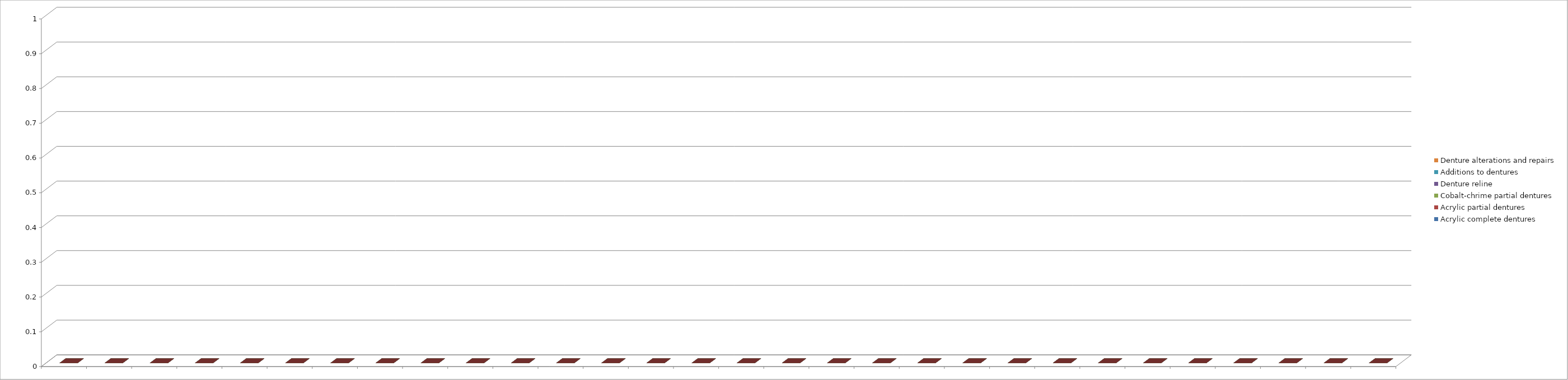
| Category | Acrylic complete dentures | Acrylic partial dentures | Cobalt-chrime partial dentures | Denture reline | Additions to dentures | Denture alterations and repairs |
|---|---|---|---|---|---|---|
| 0 | 0 | 0 | 0 | 0 | 0 | 0 |
| 1 | 0 | 0 | 0 | 0 | 0 | 0 |
| 2 | 0 | 0 | 0 | 0 | 0 | 0 |
| 3 | 0 | 0 | 0 | 0 | 0 | 0 |
| 4 | 0 | 0 | 0 | 0 | 0 | 0 |
| 5 | 0 | 0 | 0 | 0 | 0 | 0 |
| 6 | 0 | 0 | 0 | 0 | 0 | 0 |
| 7 | 0 | 0 | 0 | 0 | 0 | 0 |
| 8 | 0 | 0 | 0 | 0 | 0 | 0 |
| 9 | 0 | 0 | 0 | 0 | 0 | 0 |
| 10 | 0 | 0 | 0 | 0 | 0 | 0 |
| 11 | 0 | 0 | 0 | 0 | 0 | 0 |
| 12 | 0 | 0 | 0 | 0 | 0 | 0 |
| 13 | 0 | 0 | 0 | 0 | 0 | 0 |
| 14 | 0 | 0 | 0 | 0 | 0 | 0 |
| 15 | 0 | 0 | 0 | 0 | 0 | 0 |
| 16 | 0 | 0 | 0 | 0 | 0 | 0 |
| 17 | 0 | 0 | 0 | 0 | 0 | 0 |
| 18 | 0 | 0 | 0 | 0 | 0 | 0 |
| 19 | 0 | 0 | 0 | 0 | 0 | 0 |
| 20 | 0 | 0 | 0 | 0 | 0 | 0 |
| 21 | 0 | 0 | 0 | 0 | 0 | 0 |
| 22 | 0 | 0 | 0 | 0 | 0 | 0 |
| 23 | 0 | 0 | 0 | 0 | 0 | 0 |
| 24 | 0 | 0 | 0 | 0 | 0 | 0 |
| 25 | 0 | 0 | 0 | 0 | 0 | 0 |
| 26 | 0 | 0 | 0 | 0 | 0 | 0 |
| 27 | 0 | 0 | 0 | 0 | 0 | 0 |
| 28 | 0 | 0 | 0 | 0 | 0 | 0 |
| 29 | 0 | 0 | 0 | 0 | 0 | 0 |